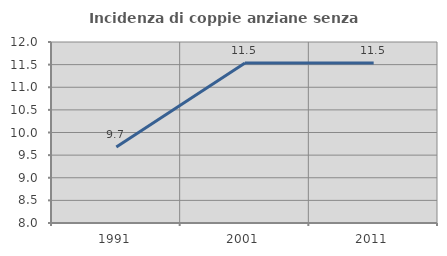
| Category | Incidenza di coppie anziane senza figli  |
|---|---|
| 1991.0 | 9.677 |
| 2001.0 | 11.538 |
| 2011.0 | 11.538 |